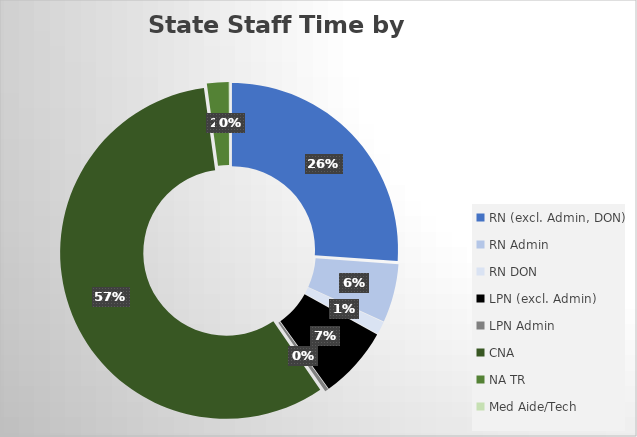
| Category | Series 0 |
|---|---|
| RN (excl. Admin, DON) | 3829.04 |
| RN Admin | 833.845 |
| RN DON | 184.003 |
| LPN (excl. Admin) | 1028.074 |
| LPN Admin | 50.471 |
| CNA | 8407.231 |
| NA TR | 308.86 |
| Med Aide/Tech | 7.481 |